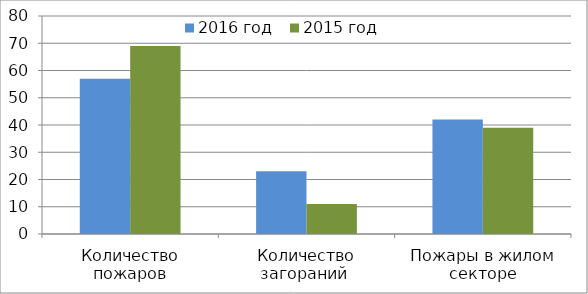
| Category | 2016 год | 2015 год |
|---|---|---|
| Количество пожаров | 57 | 69 |
| Количество загораний  | 23 | 11 |
| Пожары в жилом секторе | 42 | 39 |